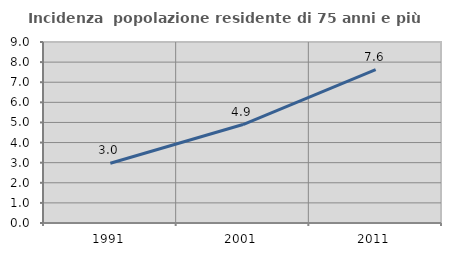
| Category | Incidenza  popolazione residente di 75 anni e più |
|---|---|
| 1991.0 | 2.97 |
| 2001.0 | 4.897 |
| 2011.0 | 7.63 |